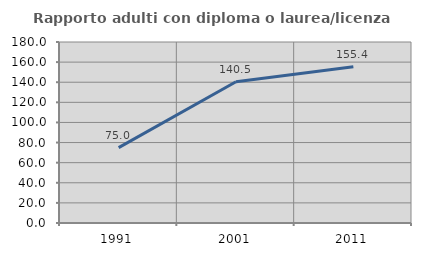
| Category | Rapporto adulti con diploma o laurea/licenza media  |
|---|---|
| 1991.0 | 75 |
| 2001.0 | 140.476 |
| 2011.0 | 155.422 |